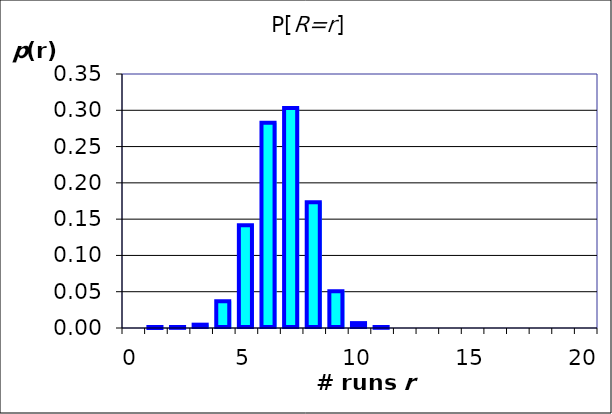
| Category |  P[R=r]  |
|---|---|
| 0.0 | 0 |
| 1.0 | 0 |
| 2.0 | 0 |
| 3.0 | 0.005 |
| 4.0 | 0.037 |
| 5.0 | 0.141 |
| 6.0 | 0.283 |
| 7.0 | 0.303 |
| 8.0 | 0.173 |
| 9.0 | 0.051 |
| 10.0 | 0.007 |
| 11.0 | 0 |
| 12.0 | 0 |
| 13.0 | 0 |
| 14.0 | 0 |
| 15.0 | 0 |
| 16.0 | 0 |
| 17.0 | 0 |
| 18.0 | 0 |
| 19.0 | 0 |
| 20.0 | 0 |